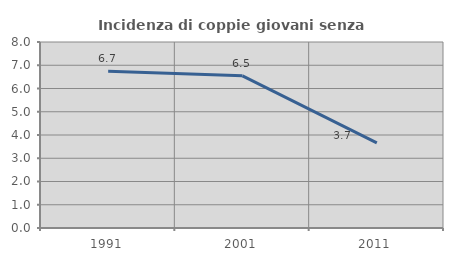
| Category | Incidenza di coppie giovani senza figli |
|---|---|
| 1991.0 | 6.739 |
| 2001.0 | 6.546 |
| 2011.0 | 3.664 |